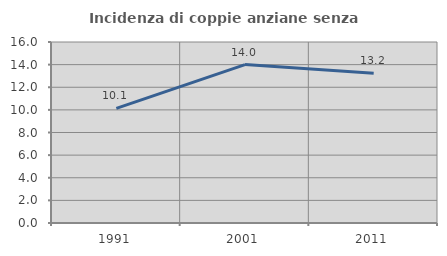
| Category | Incidenza di coppie anziane senza figli  |
|---|---|
| 1991.0 | 10.135 |
| 2001.0 | 14.003 |
| 2011.0 | 13.233 |